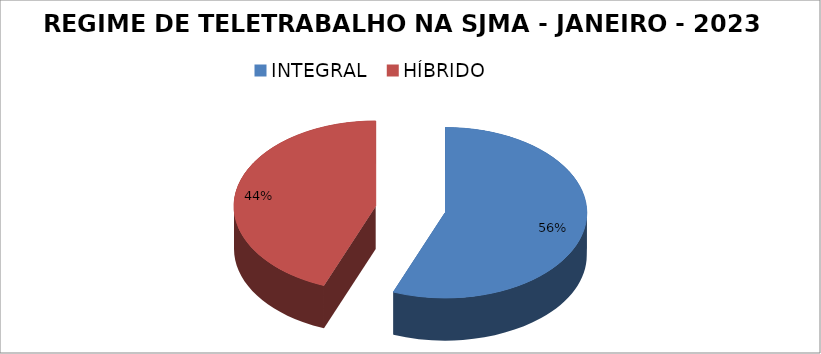
| Category | Series 0 |
|---|---|
| INTEGRAL | 80 |
| HÍBRIDO | 63 |